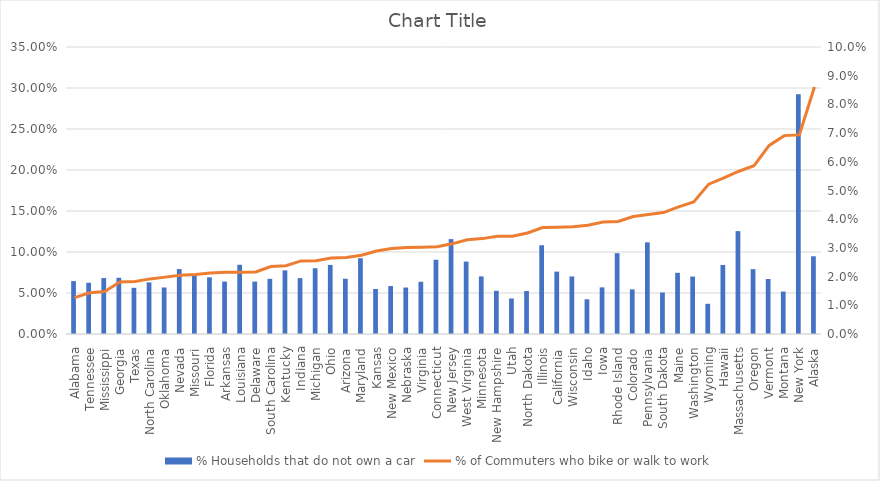
| Category | % Households that do not own a car |
|---|---|
| Alabama | 0.064 |
| Tennessee | 0.062 |
| Mississippi | 0.068 |
| Georgia | 0.069 |
| Texas | 0.056 |
| North Carolina | 0.063 |
| Oklahoma | 0.057 |
| Nevada | 0.079 |
| Missouri | 0.073 |
| Florida | 0.069 |
| Arkansas | 0.064 |
| Louisiana | 0.084 |
| Delaware | 0.064 |
| South Carolina | 0.067 |
| Kentucky | 0.078 |
| Indiana | 0.068 |
| Michigan | 0.08 |
| Ohio | 0.084 |
| Arizona | 0.067 |
| Maryland | 0.092 |
| Kansas | 0.055 |
| New Mexico | 0.058 |
| Nebraska | 0.057 |
| Virginia | 0.064 |
| Connecticut | 0.091 |
| New Jersey | 0.116 |
| West Virginia | 0.088 |
| Minnesota | 0.07 |
| New Hampshire | 0.053 |
| Utah | 0.043 |
| North Dakota | 0.052 |
| Illinois | 0.108 |
| California | 0.076 |
| Wisconsin | 0.07 |
| Idaho | 0.042 |
| Iowa | 0.057 |
| Rhode Island | 0.099 |
| Colorado | 0.054 |
| Pennsylvania | 0.112 |
| South Dakota | 0.051 |
| Maine | 0.075 |
| Washington | 0.07 |
| Wyoming | 0.037 |
| Hawaii | 0.084 |
| Massachusetts | 0.125 |
| Oregon | 0.079 |
| Vermont | 0.067 |
| Montana | 0.052 |
| New York | 0.292 |
| Alaska | 0.095 |